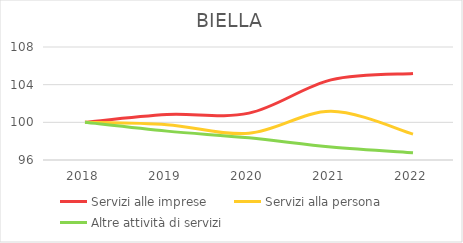
| Category | Servizi alle imprese | Servizi alla persona | Altre attività di servizi |
|---|---|---|---|
| 2018.0 | 100 | 100 | 100 |
| 2019.0 | 100.827 | 99.751 | 99.066 |
| 2020.0 | 100.977 | 98.836 | 98.357 |
| 2021.0 | 104.511 | 101.164 | 97.39 |
| 2022.0 | 105.188 | 98.753 | 96.778 |